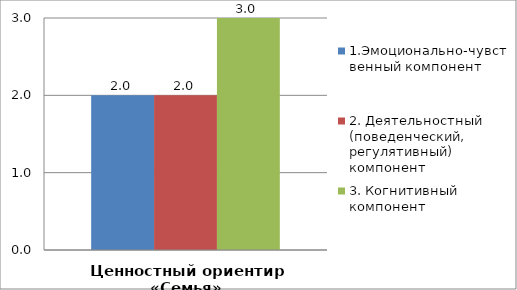
| Category | 1.Эмоционально-чувственный компонент | 2. Деятельностный (поведенческий, регулятивный) компонент | 3. Когнитивный компонент |
|---|---|---|---|
| Ценностный ориентир «Семья» | 2 | 2 | 3 |